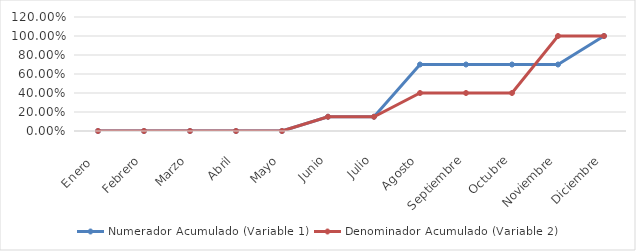
| Category | Numerador Acumulado (Variable 1) | Denominador Acumulado (Variable 2) |
|---|---|---|
| Enero  | 0 | 0 |
| Febrero | 0 | 0 |
| Marzo | 0 | 0 |
| Abril | 0 | 0 |
| Mayo | 0 | 0 |
| Junio | 0.15 | 0.15 |
| Julio | 0.15 | 0.15 |
| Agosto | 0.7 | 0.4 |
| Septiembre | 0.7 | 0.4 |
| Octubre | 0.7 | 0.4 |
| Noviembre | 0.7 | 1 |
| Diciembre | 1 | 1 |